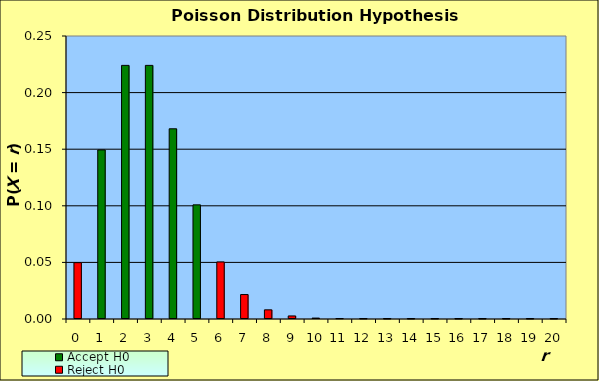
| Category | Accept H0 | Reject H0 |
|---|---|---|
| 0.0 | 0 | 0.05 |
| 1.0 | 0.149 | 0 |
| 2.0 | 0.224 | 0 |
| 3.0 | 0.224 | 0 |
| 4.0 | 0.168 | 0 |
| 5.0 | 0.101 | 0 |
| 6.0 | 0 | 0.05 |
| 7.0 | 0 | 0.022 |
| 8.0 | 0 | 0.008 |
| 9.0 | 0 | 0.003 |
| 10.0 | 0 | 0.001 |
| 11.0 | 0 | 0 |
| 12.0 | 0 | 0 |
| 13.0 | 0 | 0 |
| 14.0 | 0 | 0 |
| 15.0 | 0 | 0 |
| 16.0 | 0 | 0 |
| 17.0 | 0 | 0 |
| 18.0 | 0 | 0 |
| 19.0 | 0 | 0 |
| 20.0 | 0 | 0 |